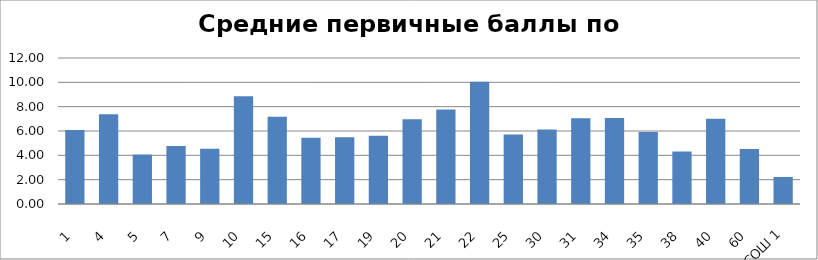
| Category | 1 4 5 7 9 10 15 16 17 19 20 21 22 25 30 31 34 35 38 40 60 ВСОШ 1 |
|---|---|
| 1 | 6.079 |
| 4 | 7.375 |
| 5 | 4.062 |
| 7 | 4.765 |
| 9 | 4.542 |
| 10 | 8.851 |
| 15 | 7.171 |
| 16 | 5.452 |
| 17 | 5.486 |
| 19 | 5.615 |
| 20 | 6.957 |
| 21 | 7.76 |
| 22 | 10.038 |
| 25 | 5.708 |
| 30 | 6.13 |
| 31 | 7.05 |
| 34 | 7.069 |
| 35 | 5.917 |
| 38 | 4.312 |
| 40 | 7 |
| 60 | 4.522 |
| ВСОШ 1 | 2.222 |